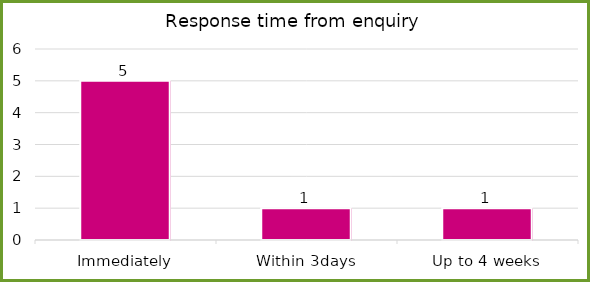
| Category | Series 0 |
|---|---|
| Immediately | 5 |
| Within 3days | 1 |
| Up to 4 weeks | 1 |